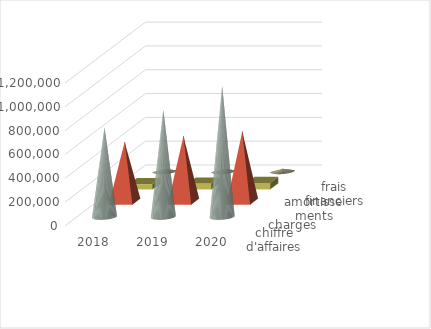
| Category | chiffre d'affaires | charges | amortissements | frais financiers |
|---|---|---|---|---|
| 2018 | 750000 | 500000 | 45000 | 15000 |
| 2019 | 900000 | 550000 | 50000 | 16000 |
| 2020 | 1100000 | 590000 | 55000 | 20000 |